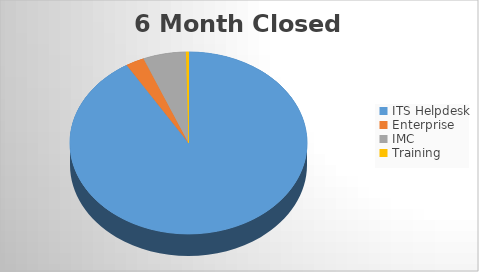
| Category | 6M Closed | 6M Opened |
|---|---|---|
| ITS Helpdesk | 2341 | 2209 |
| Enterprise | 65 | 27 |
| IMC | 150 | 103 |
| Training | 9 | 4 |